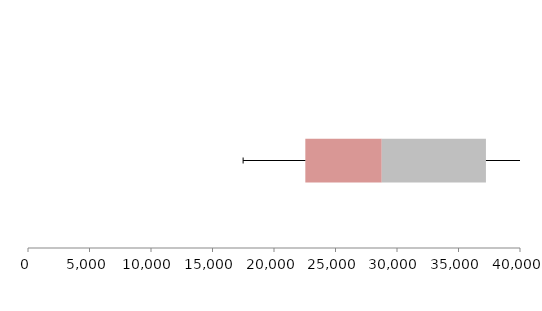
| Category | Series 1 | Series 2 | Series 3 |
|---|---|---|---|
| 0 | 22546.914 | 6213.1 | 8471.01 |